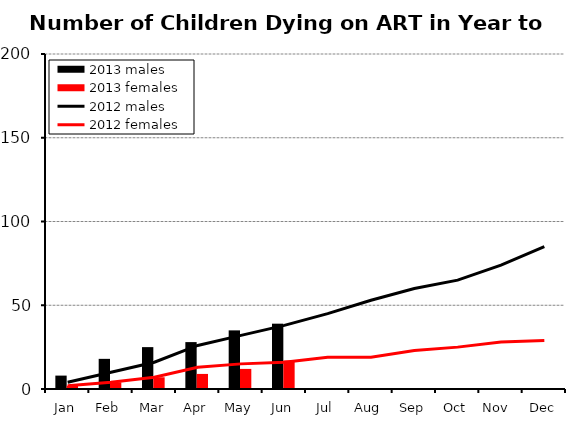
| Category | 2013 males | 2013 females |
|---|---|---|
| 0 | 8 | 2 |
| 1 | 18 | 4 |
| 2 | 25 | 7 |
| 3 | 28 | 9 |
| 4 | 35 | 12 |
| 5 | 39 | 17 |
| 6 | 0 | 0 |
| 7 | 0 | 0 |
| 8 | 0 | 0 |
| 9 | 0 | 0 |
| 10 | 0 | 0 |
| 11 | 0 | 0 |